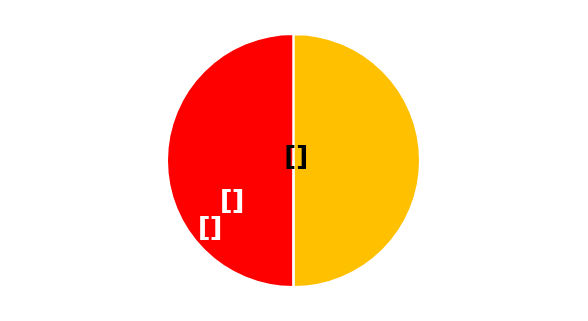
| Category | Series 0 | Fiscalizações |
|---|---|---|
| 31.0 | 31 | 31 |
| 0.0 | 0 | 0 |
| 31.0 | 31 | 31 |